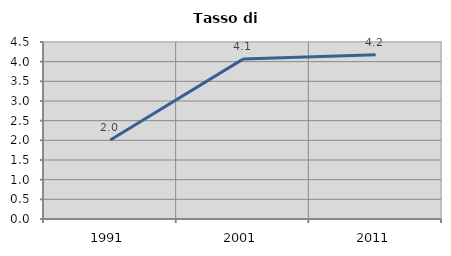
| Category | Tasso di disoccupazione   |
|---|---|
| 1991.0 | 2.01 |
| 2001.0 | 4.065 |
| 2011.0 | 4.178 |